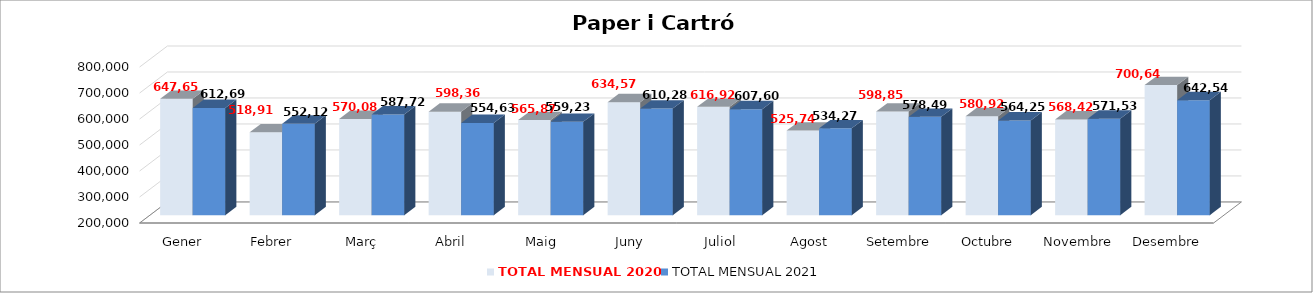
| Category | TOTAL MENSUAL 2020 | TOTAL MENSUAL 2021 |
|---|---|---|
| Gener | 647653.6 | 612689.6 |
| Febrer | 518916.06 | 552127.19 |
| Març | 570087.22 | 587720.8 |
| Abril | 598363.2 | 554630.8 |
| Maig | 565875.81 | 559230.58 |
| Juny | 634576.57 | 610281.97 |
| Juliol | 616928.45 | 607605.78 |
| Agost | 525749.01 | 534274.22 |
| Setembre | 598853.56 | 578495.04 |
| Octubre | 580924.62 | 564257.19 |
| Novembre | 568420.79 | 571530.71 |
| Desembre | 700641.17 | 642540.2 |